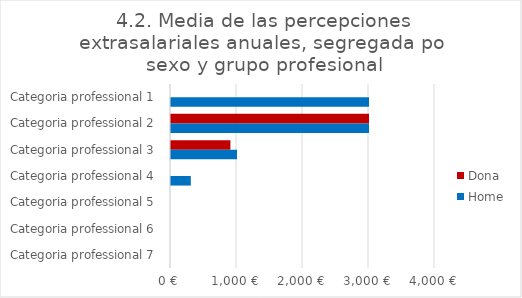
| Category | Dona | Home |
|---|---|---|
| Categoria professional 1 | 0 | 3000 |
| Categoria professional 2 | 3000 | 3000 |
| Categoria professional 3 | 900 | 1000 |
| Categoria professional 4 | 0 | 300 |
| Categoria professional 5 | 0 | 0 |
| Categoria professional 6 | 0 | 0 |
| Categoria professional 7 | 0 | 0 |